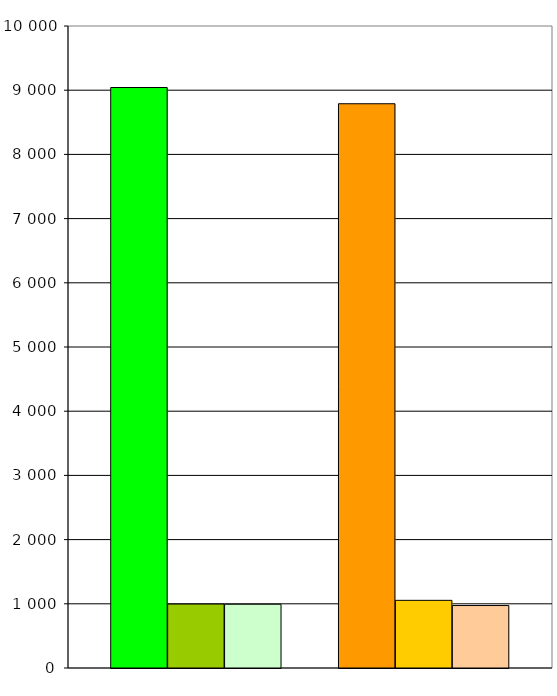
| Category | Series 0 | Series 1 | Series 2 | Series 3 | Series 4 | Series 5 | Series 6 |
|---|---|---|---|---|---|---|---|
| 0 | 9042 | 996 | 993 |  | 8789 | 1054 | 973 |